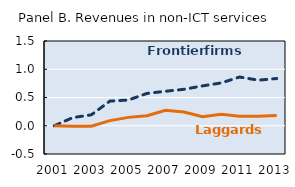
| Category | Series 0 | Series 1 |
|---|---|---|
| 2001.0 | 0 | 0 |
| 2002.0 | 0.144 | -0.011 |
| 2003.0 | 0.193 | -0.009 |
| 2004.0 | 0.436 | 0.091 |
| 2005.0 | 0.456 | 0.148 |
| 2006.0 | 0.572 | 0.176 |
| 2007.0 | 0.61 | 0.275 |
| 2008.0 | 0.645 | 0.245 |
| 2009.0 | 0.706 | 0.161 |
| 2010.0 | 0.758 | 0.204 |
| 2011.0 | 0.862 | 0.166 |
| 2012.0 | 0.807 | 0.169 |
| 2013.0 | 0.836 | 0.183 |